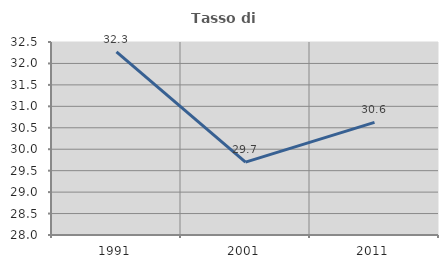
| Category | Tasso di occupazione   |
|---|---|
| 1991.0 | 32.272 |
| 2001.0 | 29.7 |
| 2011.0 | 30.625 |